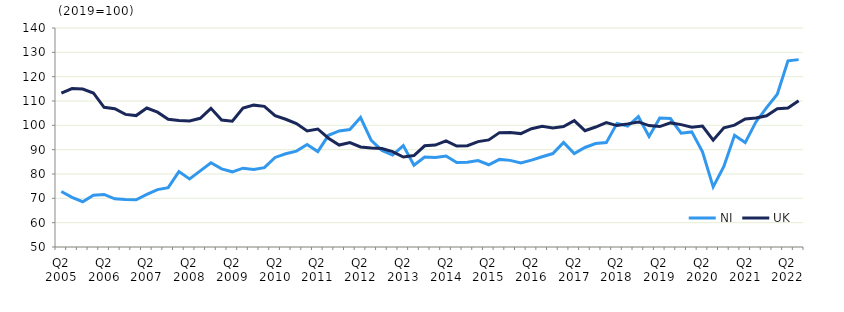
| Category | NI | UK  |
|---|---|---|
| Q2 2005 | 72.8 | 113.2 |
|  | 70.4 | 115.1 |
| Q4 2005 | 68.6 | 114.9 |
|  | 71.3 | 113.3 |
| Q2 2006 | 71.6 | 107.4 |
|  | 69.8 | 106.8 |
| Q4 2006 | 69.5 | 104.5 |
|  | 69.4 | 104 |
| Q2 2007 | 71.6 | 107.1 |
|  | 73.6 | 105.4 |
| Q4 2007 | 74.4 | 102.5 |
|  | 81 | 102 |
| Q2 2008 | 78 | 101.8 |
|  | 81.3 | 102.9 |
| Q4 2008 | 84.6 | 107 |
|  | 82.1 | 102.2 |
| Q2 2009 | 80.9 | 101.7 |
|  | 82.4 | 107.1 |
| Q4 2009 | 81.9 | 108.3 |
|  | 82.6 | 107.8 |
| Q2 2010 | 86.8 | 104 |
|  | 88.3 | 102.5 |
| Q4 2010 | 89.4 | 100.7 |
|  | 92.1 | 97.7 |
| Q2 2011 | 89.2 | 98.5 |
|  | 95.9 | 94.7 |
| Q4 2011 | 97.7 | 91.9 |
|  | 98.3 | 92.9 |
| Q2 2012 | 103.2 | 91.1 |
|  | 93.8 | 90.7 |
| Q4 2012 | 89.7 | 90.5 |
|  | 87.8 | 89.2 |
| Q2 2013 | 91.7 | 87 |
|  | 83.6 | 87.6 |
| Q4 2013 | 87 | 91.6 |
|  | 86.8 | 91.9 |
| Q2 2014 | 87.4 | 93.6 |
|  | 84.7 | 91.5 |
| Q4 2014 | 84.8 | 91.6 |
|  | 85.5 | 93.3 |
| Q2 2015 | 83.8 | 94 |
|  | 86 | 97 |
| Q4 2015 | 85.6 | 97.1 |
|  | 84.5 | 96.6 |
| Q2 2016 | 85.7 | 98.6 |
|  | 87.1 | 99.6 |
| Q4 2016 | 88.4 | 98.9 |
|  | 93 | 99.5 |
| Q2 2017 | 88.4 | 101.9 |
|  | 90.9 | 97.8 |
| Q4 2017 | 92.5 | 99.3 |
|  | 92.9 | 101.1 |
| Q2 2018 | 100.8 | 99.9 |
|  | 99.7 | 100.6 |
| Q4 2018 | 103.6 | 101.4 |
|  | 95.4 | 99.9 |
| Q2 2019 | 103 | 99.5 |
|  | 102.8 | 101 |
| Q4 2019 | 96.8 | 100.3 |
|  | 97.3 | 99.2 |
| Q2 2020 | 89.1 | 99.7 |
|  | 74.7 | 93.9 |
| Q4 2020 | 83.1 | 99 |
|  | 95.9 | 100.1 |
| Q2 2021 | 92.9 | 102.6 |
|  | 101.4 | 103 |
| Q4 2021 | 107.3 | 103.9 |
|  | 112.8 | 106.8 |
| Q2 2022 | 126.5 | 107.1 |